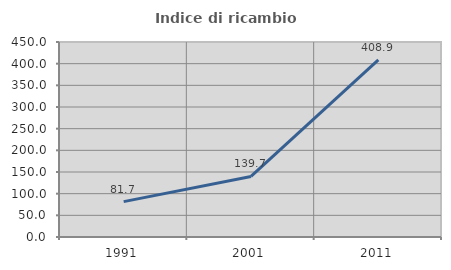
| Category | Indice di ricambio occupazionale  |
|---|---|
| 1991.0 | 81.667 |
| 2001.0 | 139.726 |
| 2011.0 | 408.889 |